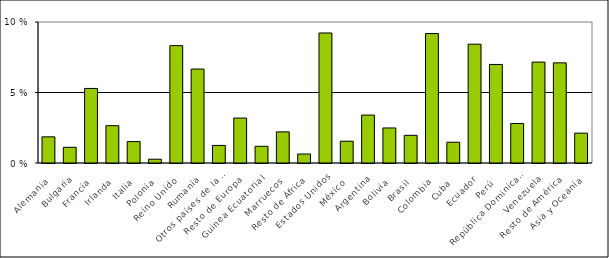
| Category | Series 0 |
|---|---|
| Alemania | 1.855 |
| Bulgaria | 1.114 |
| Francia | 5.288 |
| Irlanda | 2.646 |
| Italia | 1.52 |
| Polonia | 0.269 |
| Reino Unido | 8.323 |
| Rumanía | 6.663 |
| Otros países de la UE | 1.246 |
| Resto de Europa | 3.189 |
| Guinea Ecuatorial | 1.184 |
| Marruecos | 2.207 |
| Resto de África | 0.638 |
| Estados Unidos | 9.222 |
| México | 1.545 |
| Argentina | 3.4 |
| Bolivia | 2.485 |
| Brasil | 1.963 |
| Colombia | 9.181 |
| Cuba | 1.474 |
| Ecuador | 8.427 |
| Perú | 6.99 |
| República Dominicana | 2.799 |
| Venezuela | 7.156 |
| Resto de América | 7.102 |
| Asia y Oceanía | 2.116 |